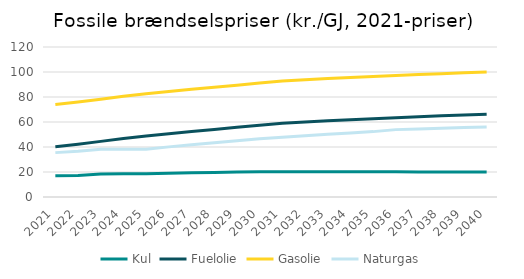
| Category | Kul | Fuelolie | Gasolie | Naturgas |
|---|---|---|---|---|
| 2021.0 | 16.975 | 40.236 | 74.002 | 35.498 |
| 2022.0 | 17.143 | 42.175 | 75.94 | 36.617 |
| 2023.0 | 18.394 | 44.493 | 78.259 | 38.258 |
| 2024.0 | 18.618 | 46.822 | 80.587 | 38.209 |
| 2025.0 | 18.66 | 48.787 | 82.553 | 38.289 |
| 2026.0 | 19.013 | 50.652 | 84.418 | 40.096 |
| 2027.0 | 19.326 | 52.384 | 86.149 | 41.783 |
| 2028.0 | 19.627 | 54.092 | 87.857 | 43.427 |
| 2029.0 | 19.912 | 55.724 | 89.49 | 45.015 |
| 2030.0 | 20.209 | 57.377 | 91.143 | 46.625 |
| 2031.0 | 20.209 | 59.086 | 92.852 | 47.836 |
| 2032.0 | 20.211 | 60.078 | 93.843 | 49.028 |
| 2033.0 | 20.197 | 60.973 | 94.738 | 50.15 |
| 2034.0 | 20.182 | 61.833 | 95.599 | 51.247 |
| 2035.0 | 20.161 | 62.638 | 96.403 | 52.304 |
| 2036.0 | 20.121 | 63.383 | 97.148 | 53.901 |
| 2037.0 | 20.072 | 64.176 | 97.942 | 54.479 |
| 2038.0 | 20.023 | 64.93 | 98.696 | 55.027 |
| 2039.0 | 19.965 | 65.613 | 99.378 | 55.524 |
| 2040.0 | 19.91 | 66.272 | 100.037 | 56.004 |